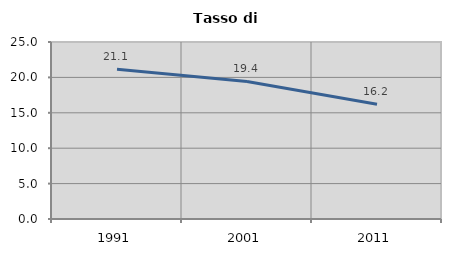
| Category | Tasso di disoccupazione   |
|---|---|
| 1991.0 | 21.143 |
| 2001.0 | 19.43 |
| 2011.0 | 16.202 |